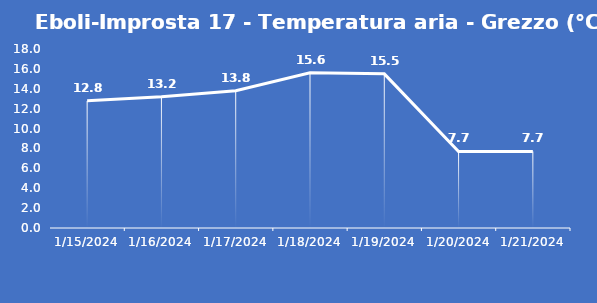
| Category | Eboli-Improsta 17 - Temperatura aria - Grezzo (°C) |
|---|---|
| 1/15/24 | 12.8 |
| 1/16/24 | 13.2 |
| 1/17/24 | 13.8 |
| 1/18/24 | 15.6 |
| 1/19/24 | 15.5 |
| 1/20/24 | 7.7 |
| 1/21/24 | 7.7 |